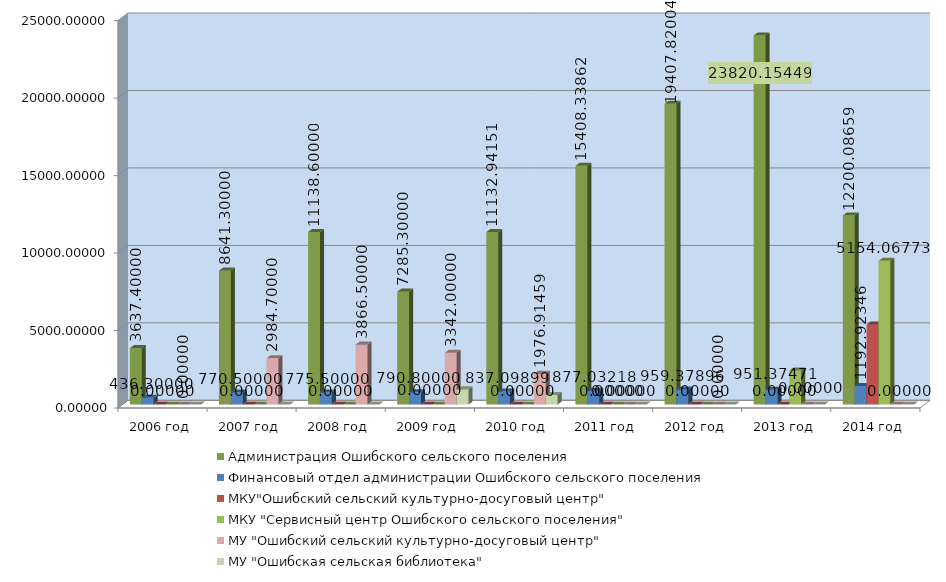
| Category | Всего расходов | в том числе: | Администрация Ошибского сельского поселения | МАУ "Ошибский сельский культурно-досуговый центр"  | МАУ "Ошибская сельская библиотека"  | Финансовый отдел администрации Ошибского сельского поселения | МКУ"Ошибский сельский культурно-досуговый центр" | МКУ "Сервисный центр Ошибского сельского поселения" | МУ "Ошибский сельский культурно-досуговый центр"  | МУ "Ошибская сельская библиотека"  |
|---|---|---|---|---|---|---|---|---|---|---|
| 2006 год |  |  | 3637.4 |  |  | 436.3 | 0 |  | 0 | 0 |
| 2007 год |  |  | 8641.3 |  |  | 770.5 | 0 |  | 2984.7 | 0 |
| 2008 год |  |  | 11138.6 |  |  | 775.5 | 0 |  | 3866.5 | 0 |
| 2009 год |  |  | 7285.3 |  |  | 790.8 | 0 |  | 3342 | 977.4 |
| 2010 год |  |  | 11132.942 |  |  | 837.099 | 0 |  | 1976.915 | 615.623 |
| 2011 год |  |  | 15408.339 |  |  | 877.032 | 0 |  | 0 | 0 |
| 2012 год |  |  | 19407.82 |  |  | 959.379 | 0 |  | 0 | 0 |
| 2013 год |  |  | 23820.154 |  |  | 951.375 | 0 |  | 0 | 0 |
| 2014 год |  |  | 12200.087 |  |  | 1192.923 | 5154.068 |  | 0 | 0 |